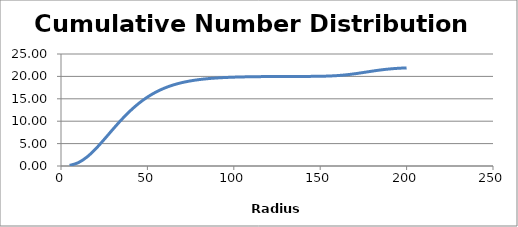
| Category | Series 0 |
|---|---|
| 5.0 | 0.126 |
| 10.0 | 0.739 |
| 15.0 | 1.995 |
| 20.0 | 3.799 |
| 25.0 | 5.937 |
| 30.0 | 8.177 |
| 35.0 | 10.335 |
| 40.0 | 12.289 |
| 45.0 | 13.976 |
| 50.0 | 15.38 |
| 55.0 | 16.513 |
| 60.0 | 17.405 |
| 65.0 | 18.093 |
| 70.0 | 18.615 |
| 75.0 | 19.003 |
| 80.0 | 19.29 |
| 85.0 | 19.498 |
| 90.0 | 19.648 |
| 95.0 | 19.755 |
| 100.0 | 19.831 |
| 105.0 | 19.884 |
| 110.0 | 19.921 |
| 115.0 | 19.946 |
| 120.0 | 19.964 |
| 125.0 | 19.976 |
| 130.0 | 19.985 |
| 135.0 | 19.991 |
| 140.0 | 19.996 |
| 145.0 | 20.006 |
| 150.0 | 20.029 |
| 155.0 | 20.081 |
| 160.0 | 20.183 |
| 165.0 | 20.351 |
| 170.0 | 20.587 |
| 175.0 | 20.872 |
| 180.0 | 21.169 |
| 185.0 | 21.439 |
| 190.0 | 21.655 |
| 195.0 | 21.807 |
| 200.0 | 21.902 |